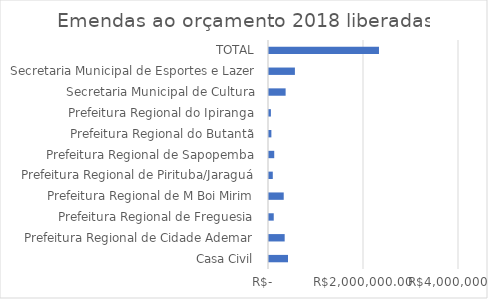
| Category | Series 0 |
|---|---|
| Casa Civil | 400000 |
| Prefeitura Regional de Cidade Ademar | 330000 |
| Prefeitura Regional de Freguesia | 100000 |
| Prefeitura Regional de M Boi Mirim | 310000 |
| Prefeitura Regional de Pirituba/Jaraguá | 80000 |
| Prefeitura Regional de Sapopemba | 110000 |
| Prefeitura Regional do Butantã | 50000 |
| Prefeitura Regional do Ipiranga | 40000 |
| Secretaria Municipal de Cultura | 350000 |
| Secretaria Municipal de Esportes e Lazer | 545454 |
| TOTAL | 2315454 |